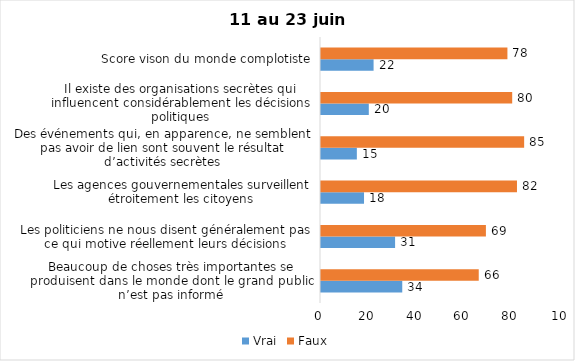
| Category | Vrai | Faux |
|---|---|---|
| Beaucoup de choses très importantes se produisent dans le monde dont le grand public n’est pas informé | 34 | 66 |
| Les politiciens ne nous disent généralement pas ce qui motive réellement leurs décisions | 31 | 69 |
| Les agences gouvernementales surveillent étroitement les citoyens | 18 | 82 |
| Des événements qui, en apparence, ne semblent pas avoir de lien sont souvent le résultat d’activités secrètes | 15 | 85 |
| Il existe des organisations secrètes qui influencent considérablement les décisions politiques | 20 | 80 |
| Score vison du monde complotiste | 22 | 78 |